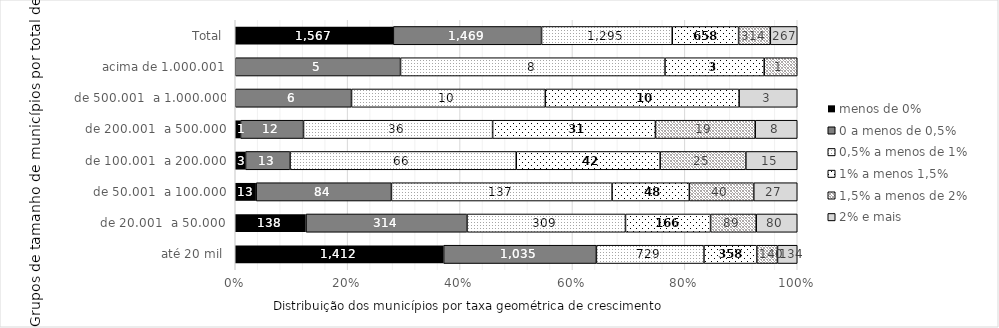
| Category | menos de 0% | 0 a menos de 0,5% | 0,5% a menos de 1% | 1% a menos 1,5% | 1,5% a menos de 2% | 2% e mais |
|---|---|---|---|---|---|---|
| até 20 mil | 1412 | 1035 | 729 | 358 | 140 | 134 |
| de 20.001  a 50.000 | 138 | 314 | 309 | 166 | 89 | 80 |
| de 50.001  a 100.000 | 13 | 84 | 137 | 48 | 40 | 27 |
| de 100.001  a 200.000 | 3 | 13 | 66 | 42 | 25 | 15 |
| de 200.001  a 500.000 | 1 | 12 | 36 | 31 | 19 | 8 |
| de 500.001  a 1.000.000 | 0 | 6 | 10 | 10 | 0 | 3 |
| acima de 1.000.001 | 0 | 5 | 8 | 3 | 1 | 0 |
| Total | 1567 | 1469 | 1295 | 658 | 314 | 267 |